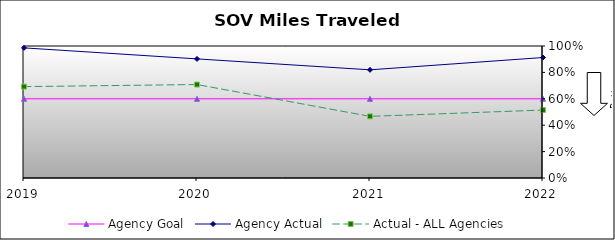
| Category | Agency Goal | Agency Actual | Actual - ALL Agencies |
|---|---|---|---|
| 2019.0 | 0.6 | 0.986 | 0.692 |
| 2020.0 | 0.6 | 0.902 | 0.708 |
| 2021.0 | 0.6 | 0.82 | 0.467 |
| 2022.0 | 0.6 | 0.913 | 0.515 |